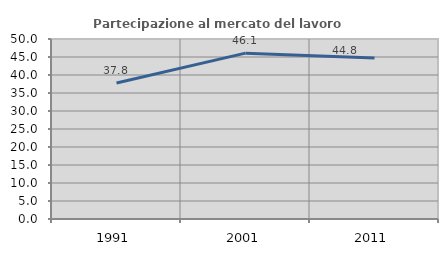
| Category | Partecipazione al mercato del lavoro  femminile |
|---|---|
| 1991.0 | 37.789 |
| 2001.0 | 46.075 |
| 2011.0 | 44.754 |